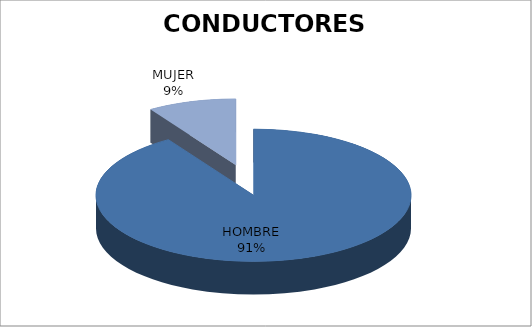
| Category | E.E. |
|---|---|
| HOMBRE | 30 |
| MUJER | 3 |